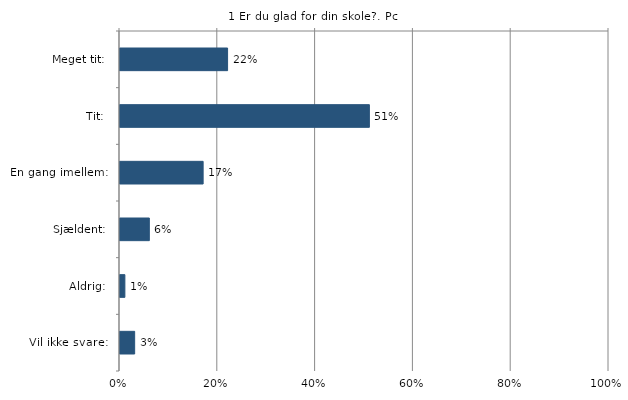
| Category | Er du glad for din skole? |
|---|---|
| Meget tit:  | 0.22 |
| Tit:  | 0.51 |
| En gang imellem:  | 0.17 |
| Sjældent:  | 0.06 |
| Aldrig:  | 0.01 |
| Vil ikke svare:  | 0.03 |